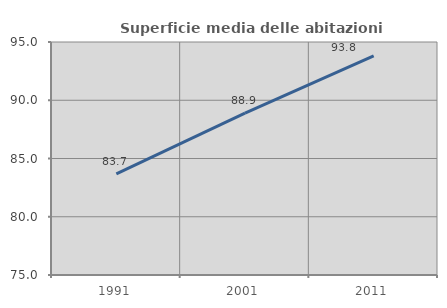
| Category | Superficie media delle abitazioni occupate |
|---|---|
| 1991.0 | 83.683 |
| 2001.0 | 88.888 |
| 2011.0 | 93.811 |